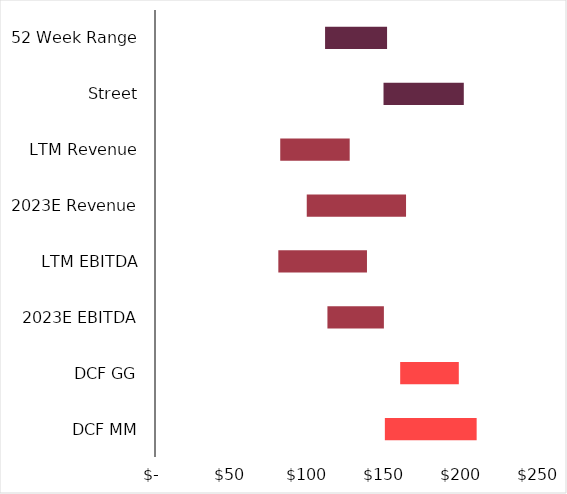
| Category | Series 0 | Series 1 |
|---|---|---|
| DCF MM | 148.876 | 59.445 |
| DCF GG | 158.799 | 37.97 |
| 2023E EBITDA | 111.679 | 36.569 |
| LTM EBITDA | 79.876 | 57.414 |
| 2023E Revenue | 98.288 | 64.302 |
| LTM Revenue | 81.111 | 44.986 |
| Street | 148 | 52 |
| 52 Week Range | 110.15 | 40.15 |